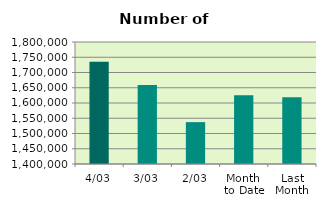
| Category | Series 0 |
|---|---|
| 4/03 | 1734898 |
| 3/03 | 1659300 |
| 2/03 | 1537258 |
| Month 
to Date | 1625476 |
| Last
Month | 1618522.4 |